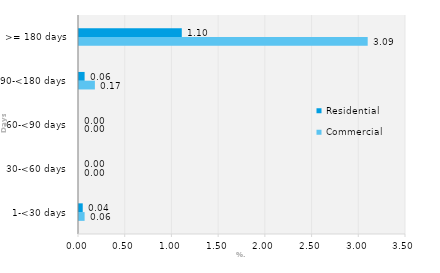
| Category | Commercial | Residential |
|---|---|---|
| 1-<30 days | 0.06 | 0.04 |
| 30-<60 days | 0 | 0 |
| 60-<90 days | 0 | 0 |
| 90-<180 days | 0.17 | 0.06 |
| >= 180 days | 3.09 | 1.1 |